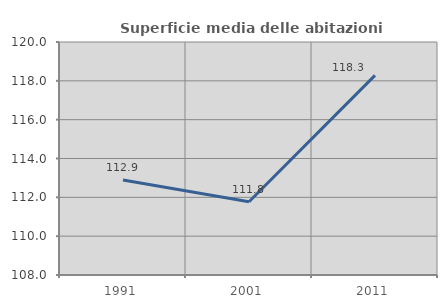
| Category | Superficie media delle abitazioni occupate |
|---|---|
| 1991.0 | 112.888 |
| 2001.0 | 111.776 |
| 2011.0 | 118.283 |